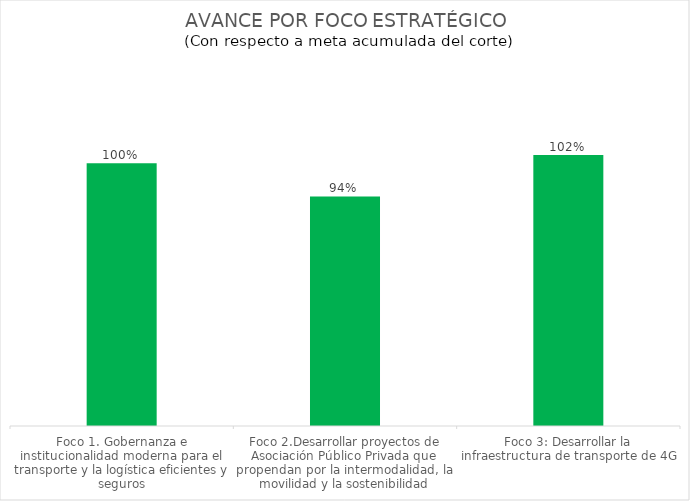
| Category | Series 0 |
|---|---|
| Foco 1. Gobernanza e institucionalidad moderna para el transporte y la logística eficientes y seguros | 1 |
| Foco 2.Desarrollar proyectos de Asociación Público Privada que propendan por la intermodalidad, la movilidad y la sostenibilidad | 0.937 |
| Foco 3: Desarrollar la infraestructura de transporte de 4G | 1.015 |